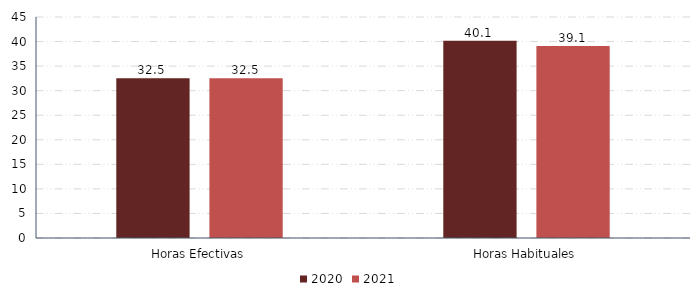
| Category | 2020 | 2021 |
|---|---|---|
| Horas Efectivas | 32.548 | 32.512 |
| Horas Habituales | 40.139 | 39.088 |